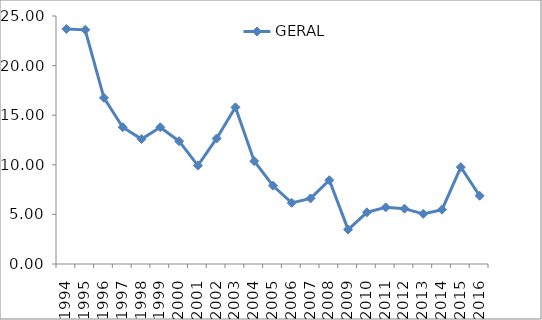
| Category | GERAL |
|---|---|
| 1994.0 | 23.699 |
| 1995.0 | 23.605 |
| 1996.0 | 16.746 |
| 1997.0 | 13.789 |
| 1998.0 | 12.588 |
| 1999.0 | 13.78 |
| 2000.0 | 12.381 |
| 2001.0 | 9.925 |
| 2002.0 | 12.654 |
| 2003.0 | 15.794 |
| 2004.0 | 10.371 |
| 2005.0 | 7.888 |
| 2006.0 | 6.162 |
| 2007.0 | 6.61 |
| 2008.0 | 8.445 |
| 2009.0 | 3.473 |
| 2010.0 | 5.208 |
| 2011.0 | 5.71 |
| 2012.0 | 5.577 |
| 2013.0 | 5.052 |
| 2014.0 | 5.478 |
| 2015.0 | 9.767 |
| 2016.0 | 6.879 |